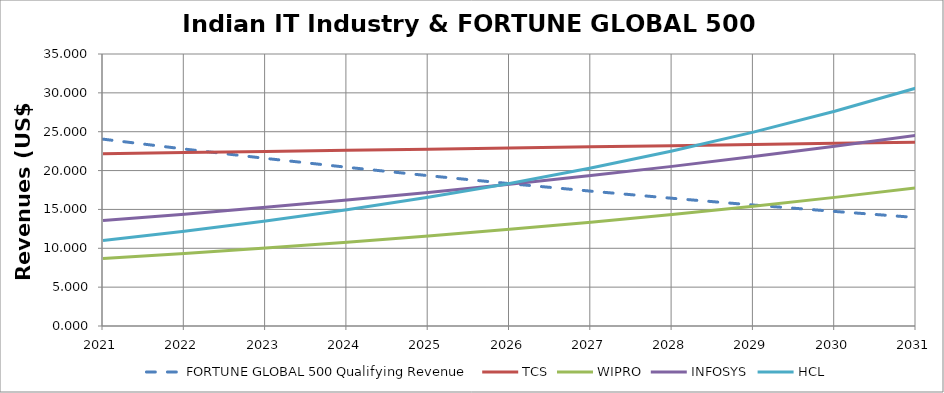
| Category | FORTUNE GLOBAL 500 Qualifying Revenue | TCS | WIPRO | INFOSYS | HCL |
|---|---|---|---|---|---|
| 2021.0 | 24.043 | 22.174 | 8.7 | 13.561 | 11 |
| 2022.0 | 22.771 | 22.318 | 9.344 | 14.39 | 12.185 |
| 2023.0 | 21.566 | 22.463 | 10.037 | 15.269 | 13.498 |
| 2024.0 | 20.425 | 22.609 | 10.78 | 16.202 | 14.953 |
| 2025.0 | 19.345 | 22.755 | 11.579 | 17.192 | 16.564 |
| 2026.0 | 18.321 | 22.903 | 12.436 | 18.243 | 18.349 |
| 2027.0 | 17.352 | 23.052 | 13.357 | 19.358 | 20.326 |
| 2028.0 | 16.434 | 23.201 | 14.347 | 20.541 | 22.516 |
| 2029.0 | 15.565 | 23.352 | 15.41 | 21.796 | 24.943 |
| 2030.0 | 14.741 | 23.503 | 16.551 | 23.128 | 27.63 |
| 2031.0 | 13.962 | 23.656 | 17.777 | 24.541 | 30.607 |